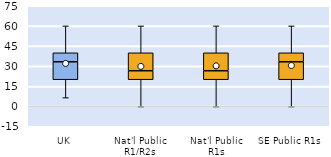
| Category | 25th | 50th | 75th |
|---|---|---|---|
| UK | 20 | 13.333 | 6.667 |
| Nat'l Public R1/R2s | 20 | 6.667 | 13.333 |
| Nat'l Public R1s | 20 | 6.667 | 13.333 |
| SE Public R1s | 20 | 13.333 | 6.667 |